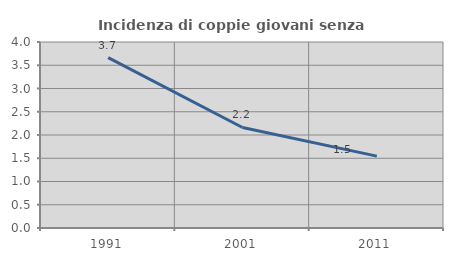
| Category | Incidenza di coppie giovani senza figli |
|---|---|
| 1991.0 | 3.665 |
| 2001.0 | 2.162 |
| 2011.0 | 1.546 |